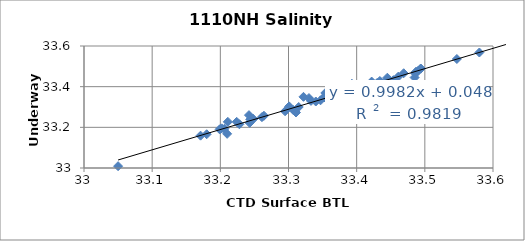
| Category | Series 0 |
|---|---|
| 33.391 | 33.386 |
| 33.33 | 33.344 |
| 33.322 | 33.35 |
| 33.365 | 33.357 |
| 33.422 | 33.425 |
| 33.494 | 33.489 |
| 33.494 | 33.489 |
| 33.619 | 33.626 |
| 33.547 | 33.536 |
| 33.469 | 33.466 |
| 33.407 | 33.407 |
| 33.315 | 33.3 |
| 33.245 | 33.24 |
| 33.487 | 33.472 |
| 33.487 | 33.472 |
| 33.248 | 33.241 |
| 33.248 | 33.241 |
| 33.199 | 33.19 |
| 33.261 | 33.25 |
| 33.307 | 33.285 |
| 33.202 | 33.195 |
| 33.301 | 33.303 |
| 33.347 | 33.333 |
| 33.224 | 33.227 |
| 33.244 | 33.239 |
| 33.242 | 33.26 |
| 33.352 | 33.348 |
| 33.333 | 33.33 |
| 33.393 | 33.414 |
| 33.49 | 33.477 |
| 33.486 | 33.465 |
| 33.295 | 33.279 |
| 33.18 | 33.166 |
| 33.369 | 33.353 |
| 33.359 | 33.354 |
| 33.358 | 33.347 |
| 33.434 | 33.428 |
| 33.436 | 33.421 |
| 33.58 | 33.568 |
| 33.354 | 33.369 |
| 33.445 | 33.444 |
| 33.353 | 33.347 |
| 33.353 | 33.347 |
| 33.311 | 33.273 |
| 33.2 | 33.192 |
| 33.34 | 33.327 |
| 33.211 | 33.227 |
| 33.171 | 33.159 |
| 33.05 | 33.009 |
| 33.206 | 33.193 |
| 33.443 | 33.424 |
| 33.264 | 33.257 |
| 33.461 | 33.449 |
| 33.43 | 33.418 |
| 33.359 | 33.356 |
| 33.454 | 33.432 |
| 33.397 | 33.365 |
| 33.371 | 33.372 |
| 33.391 | 33.38 |
| 33.394 | 33.373 |
| 33.388 | 33.373 |
| 33.392 | 33.38 |
| 33.387 | 33.37 |
| 33.228 | 33.215 |
| 33.243 | 33.222 |
| 33.413 | 33.382 |
| 33.427 | 33.411 |
| 33.21 | 33.168 |
| 33.485 | 33.445 |
| 33.362 | 33.314 |
| 33.422 | 33.394 |
| 33.406 | 33.369 |
| 33.391 | 33.375 |
| 33.391 | 33.375 |
| 33.387 | 33.362 |
| 33.369 | 33.35 |